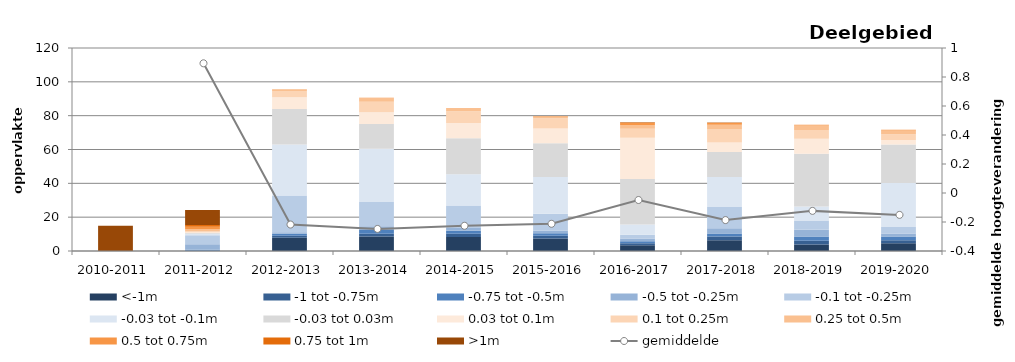
| Category | <-1m | -1 tot -0.75m | -0.75 tot -0.5m | -0.5 tot -0.25m | -0.1 tot -0.25m | -0.03 tot -0.1m | -0.03 tot 0.03m | 0.03 tot 0.1m | 0.1 tot 0.25m | 0.25 tot 0.5m | 0.5 tot 0.75m | 0.75 tot 1m | >1m |
|---|---|---|---|---|---|---|---|---|---|---|---|---|---|
| 2010-2011 | 0 | 0 | 0 | 0 | 0 | 0 | 0 | 0 | 0 | 0 | 0 | 0 | 14.907 |
| 2011-2012 | 0.002 | 0.186 | 0.55 | 3.251 | 5.352 | 0.819 | 0.45 | 0.413 | 0.684 | 1.246 | 1.342 | 1.146 | 8.869 |
| 2012-2013 | 7.839 | 1.109 | 1.193 | 0.983 | 21.745 | 30.143 | 20.915 | 6.934 | 3.654 | 0.922 | 0.16 | 0.06 | 0.008 |
| 2013-2014 | 8.625 | 1.606 | 2.152 | 2.238 | 14.376 | 31.378 | 14.641 | 7.018 | 6.131 | 2.144 | 0.229 | 0.025 | 0 |
| 2014-2015 | 8.269 | 1.988 | 1.67 | 1.719 | 13.288 | 18.477 | 21.226 | 9.049 | 6.864 | 1.82 | 0.217 | 0.001 | 0 |
| 2015-2016 | 7.393 | 1.695 | 1.367 | 1.443 | 10.124 | 21.744 | 19.948 | 8.688 | 6.105 | 1.034 | 0.263 | 0.028 | 0 |
| 2016-2017 | 3.393 | 1.154 | 1.285 | 1.596 | 2.184 | 6.051 | 26.971 | 24.252 | 5.335 | 2.265 | 1.166 | 0.288 | 0.19 |
| 2017-2018 | 6.317 | 2.207 | 1.848 | 3.032 | 12.65 | 17.761 | 14.715 | 5.59 | 7.732 | 2.746 | 0.994 | 0.267 | 0.046 |
| 2018-2019 | 3.838 | 2.28 | 2.49 | 3.948 | 5.208 | 8.613 | 31.145 | 8.868 | 5.154 | 2.662 | 0.421 | 0.048 | 0.004 |
| 2019-2020 | 4.65 | 1.685 | 2.164 | 1.849 | 3.836 | 26.042 | 22.76 | 2.698 | 3.374 | 2.152 | 0.446 | 0.052 | 0.007 |